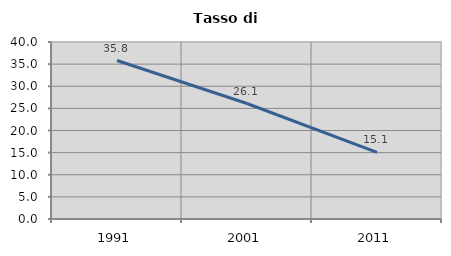
| Category | Tasso di disoccupazione   |
|---|---|
| 1991.0 | 35.809 |
| 2001.0 | 26.097 |
| 2011.0 | 15.059 |